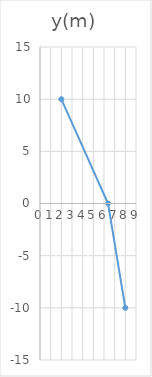
| Category | y(m) |
|---|---|
| 2.0 | 10 |
| 6.38 | 0 |
| 8.0 | -10 |